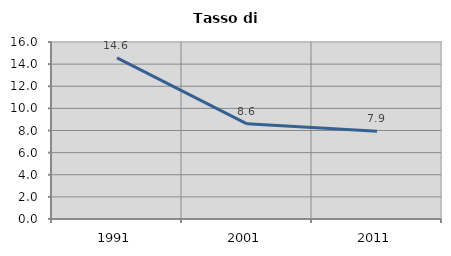
| Category | Tasso di disoccupazione   |
|---|---|
| 1991.0 | 14.559 |
| 2001.0 | 8.599 |
| 2011.0 | 7.922 |